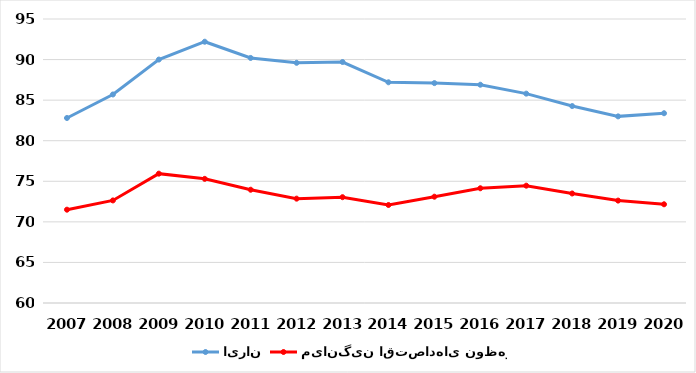
| Category | ایران | میانگین اقتصادهای نوظهور |
|---|---|---|
| 2007.0 | 82.8 | 71.5 |
| 2008.0 | 85.7 | 72.64 |
| 2009.0 | 90 | 75.94 |
| 2010.0 | 92.2 | 75.3 |
| 2011.0 | 90.2 | 73.96 |
| 2012.0 | 89.6 | 72.86 |
| 2013.0 | 89.7 | 73.04 |
| 2014.0 | 87.2 | 72.08 |
| 2015.0 | 87.1 | 73.1 |
| 2016.0 | 86.9 | 74.14 |
| 2017.0 | 85.8 | 74.46 |
| 2018.0 | 84.271 | 73.496 |
| 2019.0 | 83 | 72.62 |
| 2020.0 | 83.387 | 72.165 |